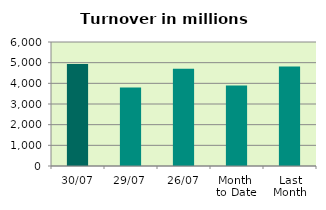
| Category | Series 0 |
|---|---|
| 30/07 | 4939.285 |
| 29/07 | 3795.707 |
| 26/07 | 4705.668 |
| Month 
to Date | 3894.038 |
| Last
Month | 4815.104 |